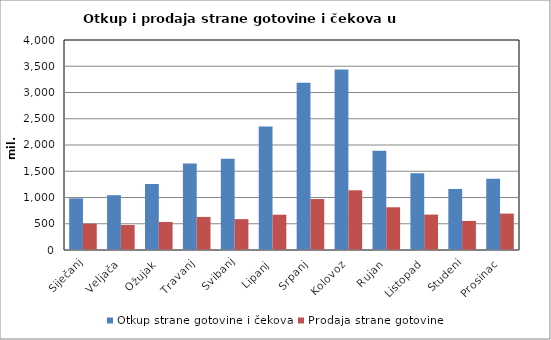
| Category | Otkup strane gotovine i čekova  | Prodaja strane gotovine  |
|---|---|---|
| Siječanj | 983632451 | 502354043 |
| Veljača | 1043876345 | 475695046 |
| Ožujak | 1258009087 | 534436305 |
| Travanj | 1648793653 | 630432220 |
| Svibanj | 1735914139 | 588000134 |
| Lipanj | 2351769008 | 672157331 |
| Srpanj | 3184671364 | 970840265 |
| Kolovoz | 3439273059 | 1137537773 |
| Rujan | 1891177583 | 813811778 |
| Listopad | 1462884708 | 674201586 |
| Studeni | 1162600205 | 553108513 |
| Prosinac | 1355422939 | 693839699 |